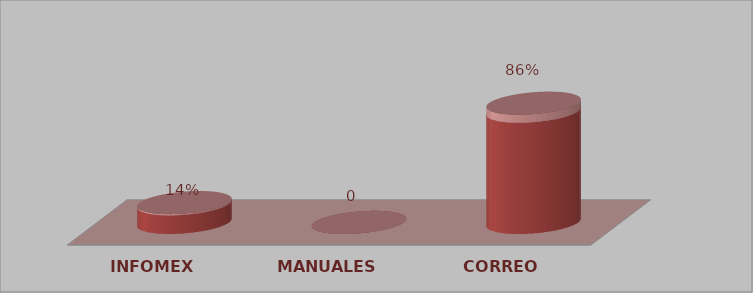
| Category | Series 0 | Series 1 |
|---|---|---|
| INFOMEX | 2 | 0.14 |
| MANUALES | 0 | 0 |
| CORREO | 12 | 0.86 |